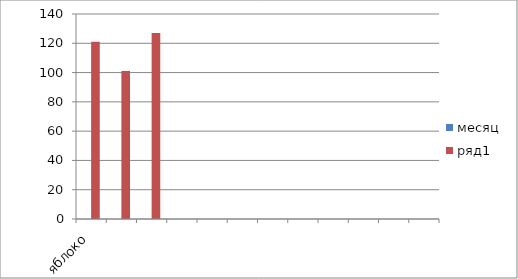
| Category | месяц | ряд1 |
|---|---|---|
| яблоко | 0 | 121 |